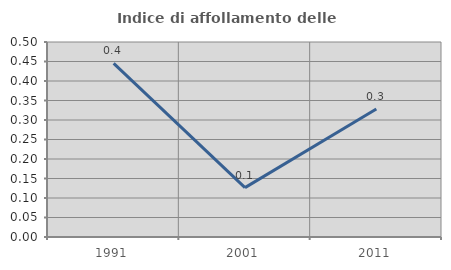
| Category | Indice di affollamento delle abitazioni  |
|---|---|
| 1991.0 | 0.445 |
| 2001.0 | 0.127 |
| 2011.0 | 0.328 |